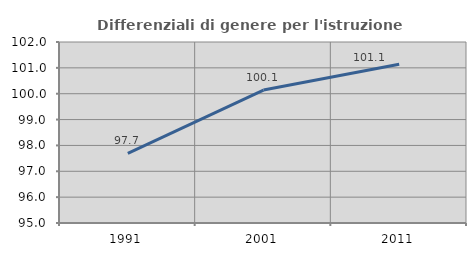
| Category | Differenziali di genere per l'istruzione superiore |
|---|---|
| 1991.0 | 97.691 |
| 2001.0 | 100.14 |
| 2011.0 | 101.142 |